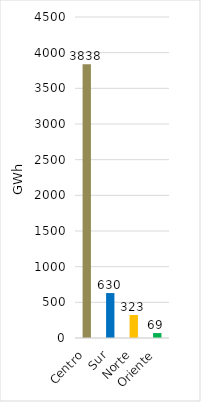
| Category | Series 0 |
|---|---|
| Centro | 3838.085 |
| Sur | 629.997 |
| Norte | 322.53 |
| Oriente | 69.007 |